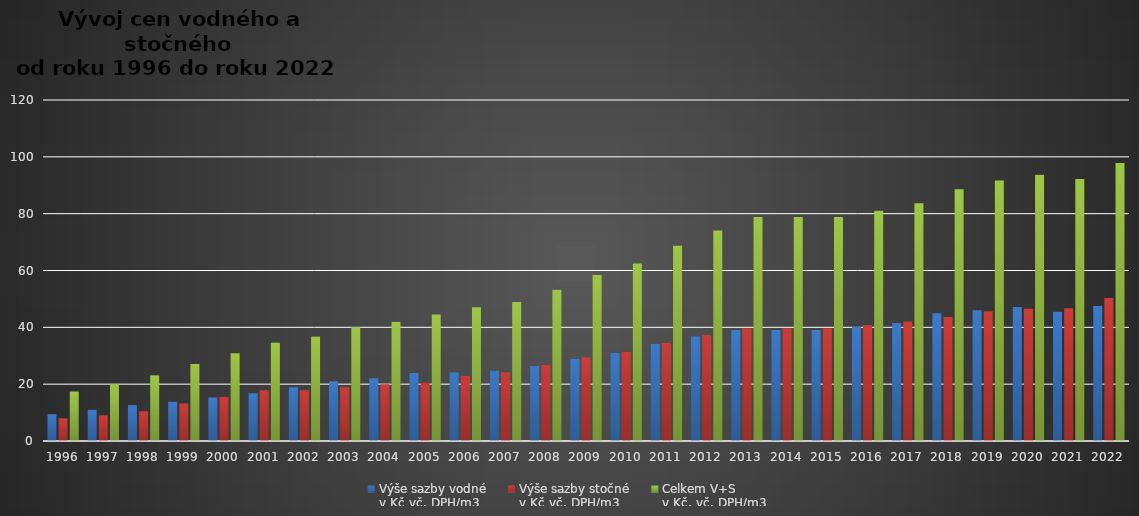
| Category | Výše sazby vodné 
v Kč vč. DPH/m3 | Výše sazby stočné 
v Kč vč. DPH/m3 | Celkem V+S 
v Kč, vč. DPH/m3 |
|---|---|---|---|
| 1996.0 | 9.45 | 7.98 | 17.43 |
| 1997.0 | 11.03 | 9.03 | 20.06 |
| 1998.0 | 12.6 | 10.5 | 23.1 |
| 1999.0 | 13.86 | 13.23 | 27.09 |
| 2000.0 | 15.33 | 15.54 | 30.87 |
| 2001.0 | 16.8 | 17.85 | 34.65 |
| 2002.0 | 18.9 | 17.85 | 36.75 |
| 2003.0 | 21 | 18.9 | 39.9 |
| 2004.0 | 22.05 | 19.95 | 42 |
| 2005.0 | 23.94 | 20.58 | 44.52 |
| 2006.0 | 24.15 | 22.89 | 47.04 |
| 2007.0 | 24.78 | 24.15 | 48.93 |
| 2008.0 | 26.38 | 26.81 | 53.19 |
| 2009.0 | 28.99 | 29.43 | 58.42 |
| 2010.0 | 31.02 | 31.48 | 62.5 |
| 2011.0 | 34.12 | 34.64 | 68.76 |
| 2012.0 | 36.78 | 37.34 | 74.12 |
| 2013.0 | 39.1 | 39.7 | 78.8 |
| 2014.0 | 39.1 | 39.7 | 78.8 |
| 2015.0 | 39.1 | 39.7 | 78.8 |
| 2016.0 | 40.25 | 40.74 | 80.99 |
| 2017.0 | 41.55 | 42.08 | 83.63 |
| 2018.0 | 44.92 | 43.66 | 88.58 |
| 2019.0 | 45.98 | 45.69 | 91.67 |
| 2020.0 | 47.12 | 46.61 | 93.73 |
| 2021.0 | 45.49 | 46.74 | 92.23 |
| 2022.0 | 47.51 | 50.29 | 97.8 |